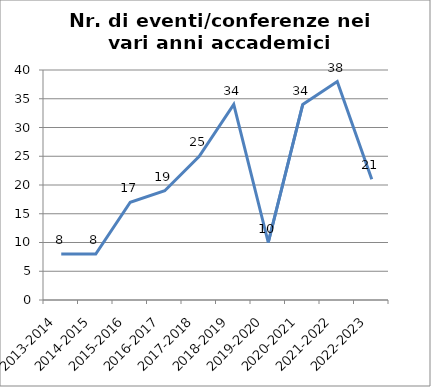
| Category | Nr. Eventi/Conferenze |
|---|---|
| 2013-2014 | 8 |
| 2014-2015 | 8 |
| 2015-2016 | 17 |
| 2016-2017 | 19 |
| 2017-2018 | 25 |
| 2018-2019 | 34 |
| 2019-2020 | 10 |
| 2020-2021 | 34 |
| 2021-2022 | 38 |
| 2022-2023 | 21 |